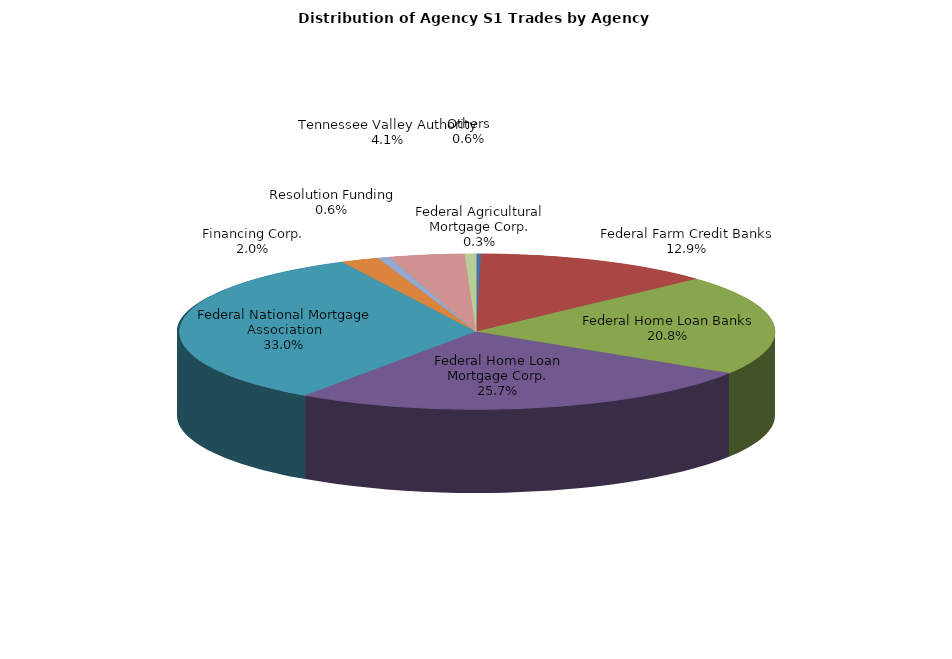
| Category | Series 0 |
|---|---|
| Federal Agricultural Mortgage Corp. | 8.61 |
| Federal Farm Credit Banks | 404.43 |
| Federal Home Loan Banks | 655.315 |
| Federal Home Loan Mortgage Corp. | 808.53 |
| Federal National Mortgage Association | 1037.02 |
| Financing Corp. | 64.474 |
| Resolution Funding | 20.239 |
| Tennessee Valley Authority | 127.912 |
| Others | 19.131 |